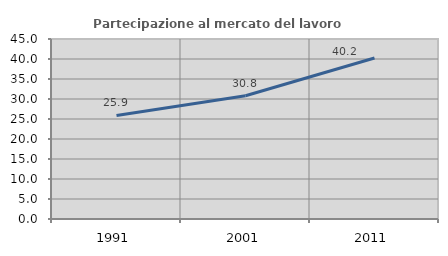
| Category | Partecipazione al mercato del lavoro  femminile |
|---|---|
| 1991.0 | 25.89 |
| 2001.0 | 30.822 |
| 2011.0 | 40.244 |